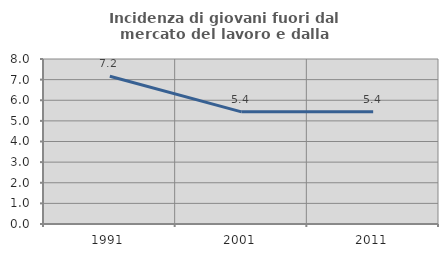
| Category | Incidenza di giovani fuori dal mercato del lavoro e dalla formazione  |
|---|---|
| 1991.0 | 7.161 |
| 2001.0 | 5.438 |
| 2011.0 | 5.444 |